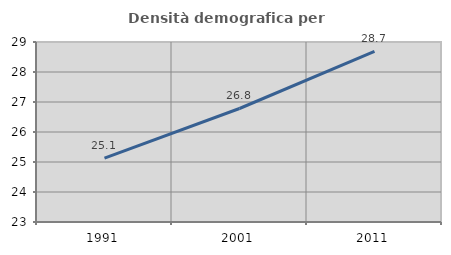
| Category | Densità demografica |
|---|---|
| 1991.0 | 25.13 |
| 2001.0 | 26.783 |
| 2011.0 | 28.687 |